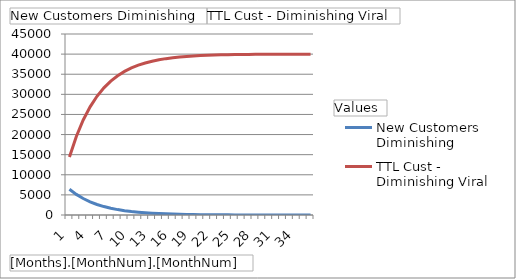
| Category | New Customers Diminishing | TTL Cust - Diminishing Viral |
|---|---|---|
| 1 | 6400 | 14400 |
| 2 | 5120 | 19520 |
| 3 | 4096 | 23616 |
| 4 | 3276.8 | 26892.8 |
| 5 | 2621.44 | 29514.24 |
| 6 | 2097.152 | 31611.392 |
| 7 | 1677.722 | 33289.114 |
| 8 | 1342.177 | 34631.291 |
| 9 | 1073.742 | 35705.033 |
| 10 | 858.993 | 36564.026 |
| 11 | 687.195 | 37251.221 |
| 12 | 549.756 | 37800.977 |
| 13 | 439.805 | 38240.781 |
| 14 | 351.844 | 38592.625 |
| 15 | 281.475 | 38874.1 |
| 16 | 225.18 | 39099.28 |
| 17 | 180.144 | 39279.424 |
| 18 | 144.115 | 39423.539 |
| 19 | 115.292 | 39538.831 |
| 20 | 92.234 | 39631.065 |
| 21 | 73.787 | 39704.852 |
| 22 | 59.03 | 39763.882 |
| 23 | 47.224 | 39811.105 |
| 24 | 37.779 | 39848.884 |
| 25 | 30.223 | 39879.107 |
| 26 | 24.179 | 39903.286 |
| 27 | 19.343 | 39922.629 |
| 28 | 15.474 | 39938.103 |
| 29 | 12.379 | 39950.482 |
| 30 | 9.904 | 39960.386 |
| 31 | 7.923 | 39968.309 |
| 32 | 6.338 | 39974.647 |
| 33 | 5.071 | 39979.718 |
| 34 | 4.056 | 39983.774 |
| 35 | 3.245 | 39987.019 |
| 36 | 2.596 | 39989.615 |